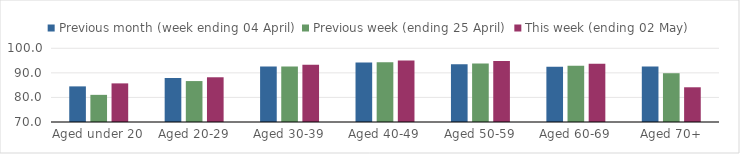
| Category | Previous month (week ending 04 April) | Previous week (ending 25 April) | This week (ending 02 May) |
|---|---|---|---|
| Aged under 20 | 84.496 | 81.051 | 85.716 |
| Aged 20-29 | 87.917 | 86.658 | 88.204 |
| Aged 30-39 | 92.601 | 92.614 | 93.289 |
| Aged 40-49 | 94.238 | 94.303 | 94.997 |
| Aged 50-59 | 93.539 | 93.843 | 94.816 |
| Aged 60-69 | 92.529 | 92.887 | 93.706 |
| Aged 70+ | 92.581 | 89.855 | 84.129 |